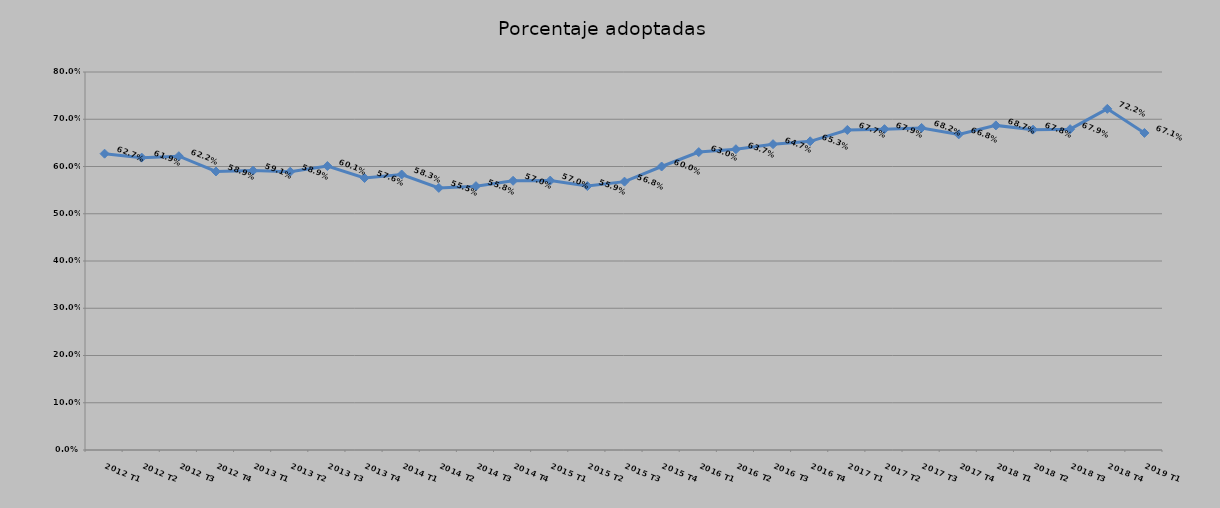
| Category | Porcentaje adoptadas |
|---|---|
| 2012 T1 | 0.627 |
| 2012 T2 | 0.619 |
| 2012 T3 | 0.622 |
| 2012 T4 | 0.589 |
| 2013 T1 | 0.591 |
| 2013 T2 | 0.589 |
| 2013 T3 | 0.601 |
| 2013 T4 | 0.576 |
| 2014 T1 | 0.583 |
| 2014 T2 | 0.555 |
| 2014 T3 | 0.558 |
| 2014 T4 | 0.57 |
| 2015 T1 | 0.57 |
| 2015 T2 | 0.559 |
| 2015 T3 | 0.568 |
| 2015 T4 | 0.6 |
| 2016 T1 | 0.63 |
| 2016 T2 | 0.637 |
| 2016 T3 | 0.647 |
| 2016 T4 | 0.653 |
| 2017 T1 | 0.677 |
| 2017 T2 | 0.679 |
| 2017 T3 | 0.682 |
| 2017 T4 | 0.668 |
| 2018 T1 | 0.687 |
| 2018 T2 | 0.678 |
| 2018 T3 | 0.679 |
| 2018 T4 | 0.722 |
| 2019 T1 | 0.671 |